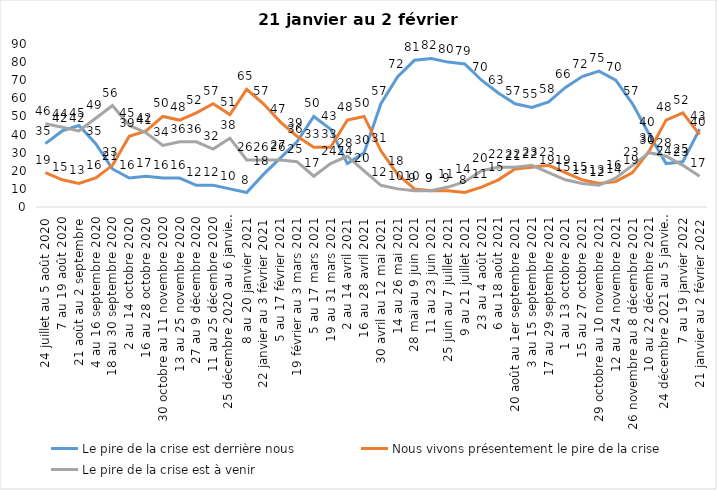
| Category | Le pire de la crise est derrière nous | Nous vivons présentement le pire de la crise | Le pire de la crise est à venir |
|---|---|---|---|
| 24 juillet au 5 août 2020 | 35 | 19 | 46 |
| 7 au 19 août 2020 | 42 | 15 | 44 |
| 21 août au 2 septembre | 45 | 13 | 42 |
| 4 au 16 septembre 2020 | 35 | 16 | 49 |
| 18 au 30 septembre 2020 | 21 | 23 | 56 |
| 2 au 14 octobre 2020 | 16 | 39 | 45 |
| 16 au 28 octobre 2020 | 17 | 42 | 41 |
| 30 octobre au 11 novembre 2020 | 16 | 50 | 34 |
| 13 au 25 novembre 2020 | 16 | 48 | 36 |
| 27 au 9 décembre 2020 | 12 | 52 | 36 |
| 11 au 25 décembre 2020 | 12 | 57 | 32 |
| 25 décembre 2020 au 6 janvier 2021 | 10 | 51 | 38 |
| 8 au 20 janvier 2021 | 8 | 65 | 26 |
| 22 janvier au 3 février 2021 | 18 | 57 | 26 |
| 5 au 17 février 2021 | 27 | 47 | 26 |
| 19 février au 3 mars 2021 | 36 | 39 | 25 |
| 5 au 17 mars 2021 | 50 | 33 | 17 |
| 19 au 31 mars 2021 | 43 | 33 | 24 |
| 2 au 14 avril 2021 | 24 | 48 | 28 |
| 16 au 28 avril 2021 | 30 | 50 | 20 |
| 30 avril au 12 mai 2021 | 57 | 31 | 12 |
| 14 au 26 mai 2021 | 72 | 18 | 10 |
| 28 mai au 9 juin 2021 | 81 | 10 | 9 |
| 11 au 23 juin 2021 | 82 | 9 | 9 |
| 25 juin au 7 juillet 2021 | 80 | 9 | 11 |
| 9 au 21 juillet 2021 | 79 | 8 | 14 |
| 23 au 4 août 2021 | 70 | 11 | 20 |
| 6 au 18 août 2021 | 63 | 15 | 22 |
| 20 août au 1er septembre 2021 | 57 | 21 | 22 |
| 3 au 15 septembre 2021 | 55 | 22 | 23 |
| 17 au 29 septembre 2021 | 58 | 23 | 19 |
| 1 au 13 octobre 2021 | 66 | 19 | 15 |
| 15 au 27 octobre 2021 | 72 | 15 | 13 |
| 29 octobre au 10 novembre 2021 | 75 | 13 | 12 |
| 12 au 24 novembre 2021 | 70 | 14 | 16 |
| 26 novembre au 8 décembre 2021 | 57 | 19 | 23 |
| 10 au 22 décembre 2021 | 40 | 31 | 30 |
| 24 décembre 2021 au 5 janvier 2022 | 24 | 48 | 28 |
| 7 au 19 janvier 2022 | 25 | 52 | 23 |
| 21 janvier au 2 février 2022 | 43 | 40 | 17 |